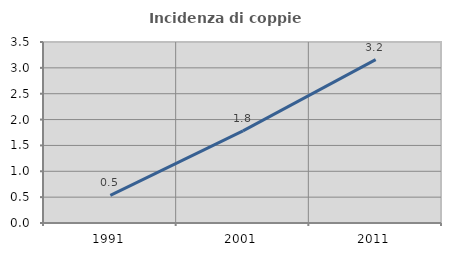
| Category | Incidenza di coppie miste |
|---|---|
| 1991.0 | 0.532 |
| 2001.0 | 1.781 |
| 2011.0 | 3.158 |